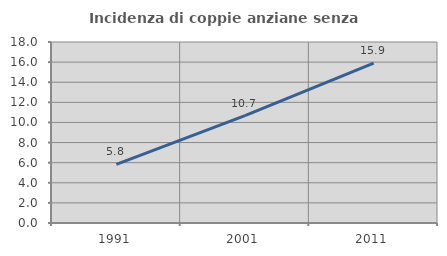
| Category | Incidenza di coppie anziane senza figli  |
|---|---|
| 1991.0 | 5.821 |
| 2001.0 | 10.673 |
| 2011.0 | 15.895 |